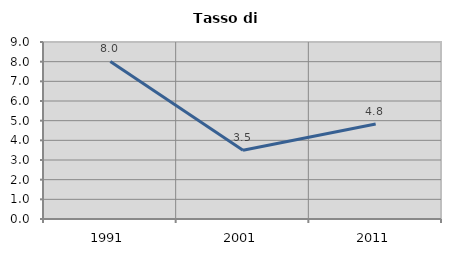
| Category | Tasso di disoccupazione   |
|---|---|
| 1991.0 | 8.009 |
| 2001.0 | 3.493 |
| 2011.0 | 4.832 |